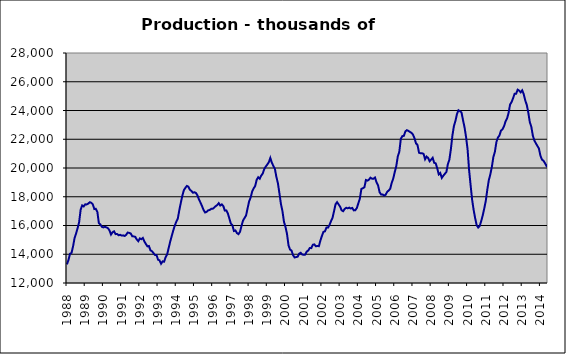
| Category | Series 0 |
|---|---|
| 1988.0 | 13298 |
| nan | 13613 |
| nan | 14036 |
| nan | 14095 |
| nan | 14552 |
| nan | 15129 |
| nan | 15453 |
| nan | 15821 |
| nan | 16239 |
| nan | 17103 |
| nan | 17396 |
| nan | 17325 |
| 1989.0 | 17470 |
| nan | 17468 |
| nan | 17520 |
| nan | 17623 |
| nan | 17580 |
| nan | 17470 |
| nan | 17146 |
| nan | 17161 |
| nan | 16951 |
| nan | 16166 |
| nan | 16071 |
| nan | 15906 |
| 1990.0 | 15869 |
| nan | 15914 |
| nan | 15868 |
| nan | 15812 |
| nan | 15656 |
| nan | 15368 |
| nan | 15531 |
| nan | 15596 |
| nan | 15400 |
| nan | 15410 |
| nan | 15322 |
| nan | 15353 |
| 1991.0 | 15299 |
| nan | 15313 |
| nan | 15269 |
| nan | 15352 |
| nan | 15508 |
| nan | 15484 |
| nan | 15445 |
| nan | 15255 |
| nan | 15241 |
| nan | 15209 |
| nan | 15023 |
| nan | 14910 |
| 1992.0 | 15103 |
| nan | 15050 |
| nan | 15135 |
| nan | 14888 |
| nan | 14713 |
| nan | 14549 |
| nan | 14574 |
| nan | 14269 |
| nan | 14214 |
| nan | 14079 |
| nan | 13946 |
| nan | 13943 |
| 1993.0 | 13620 |
| nan | 13569 |
| nan | 13340 |
| nan | 13504 |
| nan | 13481 |
| nan | 13797 |
| nan | 13989 |
| nan | 14432 |
| nan | 14873 |
| nan | 15260 |
| nan | 15641 |
| nan | 15980 |
| 1994.0 | 16256 |
| nan | 16466 |
| nan | 17054 |
| nan | 17574 |
| nan | 18062 |
| nan | 18451 |
| nan | 18618 |
| nan | 18754 |
| nan | 18702 |
| nan | 18488 |
| nan | 18404 |
| nan | 18280 |
| 1995.0 | 18315 |
| nan | 18263 |
| nan | 18087 |
| nan | 17804 |
| nan | 17586 |
| nan | 17349 |
| nan | 17082 |
| nan | 16908 |
| nan | 16945 |
| nan | 17055 |
| nan | 17076 |
| nan | 17157 |
| 1996.0 | 17157 |
| nan | 17246 |
| nan | 17345 |
| nan | 17421 |
| nan | 17552 |
| nan | 17389 |
| nan | 17467 |
| nan | 17359 |
| nan | 17039 |
| nan | 17049 |
| nan | 16842 |
| nan | 16490 |
| 1997.0 | 16125 |
| nan | 16022 |
| nan | 15618 |
| nan | 15657 |
| nan | 15473 |
| nan | 15399 |
| nan | 15558 |
| nan | 15966 |
| nan | 16344 |
| nan | 16521 |
| nan | 16693 |
| nan | 17188 |
| 1998.0 | 17666 |
| nan | 17940 |
| nan | 18356 |
| nan | 18585 |
| nan | 18742 |
| nan | 19179 |
| nan | 19354 |
| nan | 19252 |
| nan | 19468 |
| nan | 19619 |
| nan | 19925 |
| nan | 20099 |
| 1999.0 | 20243 |
| nan | 20402 |
| nan | 20700 |
| nan | 20367 |
| nan | 20147 |
| nan | 19940 |
| nan | 19377 |
| nan | 18941 |
| nan | 18238 |
| nan | 17487 |
| nan | 16998 |
| nan | 16256 |
| 2000.0 | 15900 |
| nan | 15406 |
| nan | 14611 |
| nan | 14329 |
| nan | 14253 |
| nan | 13932 |
| nan | 13779 |
| nan | 13801.4 |
| nan | 13830.4 |
| nan | 14037.4 |
| nan | 14101.4 |
| nan | 13983.1 |
| 2001.0 | 13960.1 |
| nan | 13974.1 |
| nan | 14189.1 |
| nan | 14260.1 |
| nan | 14432.1 |
| nan | 14427.1 |
| nan | 14658.1 |
| nan | 14686.7 |
| nan | 14553.7 |
| nan | 14574.7 |
| nan | 14561.7 |
| nan | 14957 |
| 2002.0 | 15275 |
| nan | 15557 |
| nan | 15595 |
| nan | 15856 |
| nan | 15851.599 |
| nan | 16039.659 |
| nan | 16305.273 |
| nan | 16538.099 |
| nan | 17002.492 |
| nan | 17480.564 |
| nan | 17624.181 |
| nan | 17467.591 |
| 2003.0 | 17309.332 |
| nan | 17053.665 |
| nan | 16997.03 |
| nan | 17151.655 |
| nan | 17232.406 |
| nan | 17196.823 |
| nan | 17241.683 |
| nan | 17181.379 |
| nan | 17220.897 |
| nan | 17052.724 |
| nan | 17061.407 |
| nan | 17213.928 |
| 2004.0 | 17541.226 |
| nan | 17867.995 |
| nan | 18539.895 |
| nan | 18598.329 |
| nan | 18656.076 |
| nan | 19166.251 |
| nan | 19120.661 |
| nan | 19189.733 |
| nan | 19328.127 |
| nan | 19258.289 |
| nan | 19252.511 |
| nan | 19338.37 |
| 2005.0 | 18996.26 |
| nan | 18796.585 |
| nan | 18320.167 |
| nan | 18157.703 |
| nan | 18162.296 |
| nan | 18079.378 |
| nan | 18137.193 |
| nan | 18341.12 |
| nan | 18433.673 |
| nan | 18552.613 |
| nan | 18965.757 |
| nan | 19260.619 |
| 2006.0 | 19721.48 |
| nan | 20125.464 |
| nan | 20802.737 |
| nan | 21126.107 |
| nan | 22029.619 |
| nan | 22217.811 |
| nan | 22237.362 |
| nan | 22547.07 |
| nan | 22632.333 |
| nan | 22582.778 |
| nan | 22510.289 |
| nan | 22448.548 |
| 2007.0 | 22323.973 |
| nan | 22075.929 |
| nan | 21715.697 |
| nan | 21604.441 |
| nan | 21062.597 |
| nan | 21023.355 |
| nan | 21024.846 |
| nan | 20981.485 |
| nan | 20607.715 |
| nan | 20797.229 |
| nan | 20694.61 |
| nan | 20471.092 |
| 2008.0 | 20585.2 |
| nan | 20710.561 |
| nan | 20358.458 |
| nan | 20325.647 |
| nan | 19979.543 |
| nan | 19554.517 |
| nan | 19651.268 |
| nan | 19311.858 |
| nan | 19461.289 |
| nan | 19595.012 |
| nan | 19713.509 |
| nan | 20258.46 |
| 2009.0 | 20578.483 |
| nan | 21319.355 |
| nan | 22259.016 |
| nan | 22920.613 |
| nan | 23274.392 |
| nan | 23748.382 |
| nan | 24015.968 |
| nan | 23949.497 |
| nan | 23863.422 |
| nan | 23322.324 |
| nan | 22828.491 |
| nan | 22156.289 |
| 2010.0 | 21300.696 |
| nan | 19860.435 |
| nan | 18798.577 |
| nan | 17788.895 |
| nan | 17077.542 |
| nan | 16503.382 |
| nan | 16020.404 |
| nan | 15856.582 |
| nan | 15970.325 |
| nan | 16313.459 |
| nan | 16710.849 |
| nan | 17190.1 |
| 2011.0 | 17714.519 |
| nan | 18495.045 |
| nan | 19156.284 |
| nan | 19557.491 |
| nan | 20077.898 |
| nan | 20765.665 |
| nan | 21128.425 |
| nan | 21807.194 |
| nan | 22118.818 |
| nan | 22265.055 |
| nan | 22598.415 |
| nan | 22689.418 |
| 2012.0 | 22897.671 |
| nan | 23231.411 |
| nan | 23440.859 |
| nan | 23818.515 |
| nan | 24413.871 |
| nan | 24588.394 |
| nan | 24861.032 |
| nan | 25161.729 |
| nan | 25167.17 |
| nan | 25447.846 |
| nan | 25381.393 |
| nan | 25264.451 |
| 2013.0 | 25405.25 |
| nan | 25140.11 |
| nan | 24700.704 |
| nan | 24392.196 |
| nan | 23867.507 |
| nan | 23197.845 |
| nan | 22875.331 |
| nan | 22255.465 |
| nan | 21921.342 |
| nan | 21717.58 |
| nan | 21535.364 |
| nan | 21359.765 |
| 2014.0 | 20861.327 |
| nan | 20587.907 |
| nan | 20504.788 |
| nan | 20340.152 |
| nan | 20140.75 |
| nan | 20242.709 |